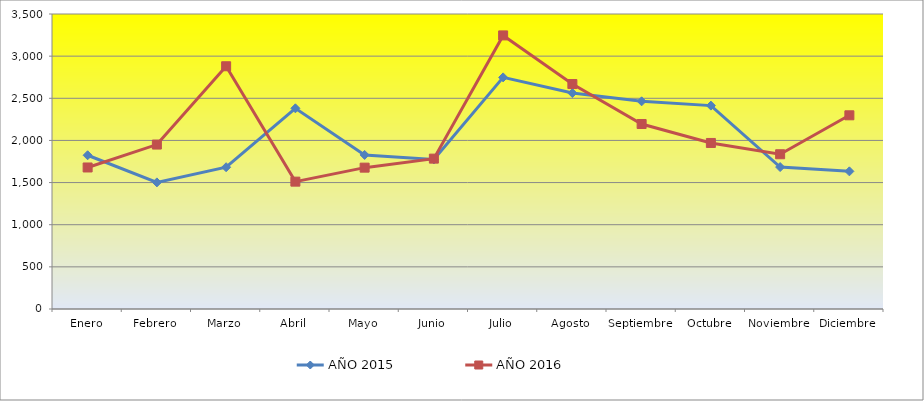
| Category | AÑO 2015 | AÑO 2016 |
|---|---|---|
| Enero | 1824 | 1679 |
| Febrero | 1502 | 1951 |
| Marzo | 1682 | 2880 |
| Abril | 2381 | 1511 |
| Mayo | 1828 | 1677 |
| Junio | 1775 | 1784 |
| Julio | 2748 | 3246 |
| Agosto | 2562 | 2669 |
| Septiembre | 2464 | 2195 |
| Octubre | 2413 | 1970 |
| Noviembre | 1684 | 1836 |
| Diciembre | 1633 | 2298 |